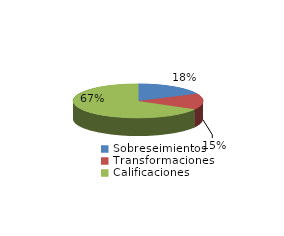
| Category | Series 0 |
|---|---|
| Sobreseimientos | 411 |
| Transformaciones | 352 |
| Calificaciones | 1528 |